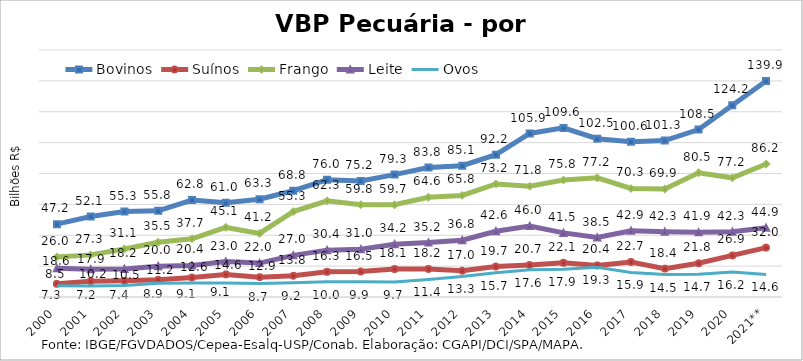
| Category | Bovinos | Suínos | Frango | Leite | Ovos |
|---|---|---|---|---|---|
| 2000 | 47.173 | 8.541 | 25.957 | 18.633 | 7.285 |
| 2001 | 52.145 | 10.247 | 27.283 | 17.93 | 7.179 |
| 2002 | 55.336 | 10.503 | 31.142 | 18.155 | 7.396 |
| 2003 | 55.848 | 11.225 | 35.505 | 19.993 | 8.947 |
| 2004 | 62.836 | 12.62 | 37.701 | 20.434 | 9.068 |
| 2005 | 61.005 | 14.632 | 45.074 | 22.982 | 9.129 |
| 2006 | 63.338 | 12.871 | 41.178 | 21.952 | 8.672 |
| 2007 | 68.833 | 13.763 | 55.326 | 26.987 | 9.216 |
| 2008 | 76 | 16.296 | 62.279 | 30.359 | 9.954 |
| 2009 | 75.208 | 16.473 | 59.797 | 30.951 | 9.925 |
| 2010 | 79.291 | 18.122 | 59.725 | 34.181 | 9.653 |
| 2011 | 83.823 | 18.151 | 64.595 | 35.237 | 11.374 |
| 2012 | 85.073 | 17.042 | 65.801 | 36.821 | 13.333 |
| 2013 | 92.189 | 19.733 | 73.237 | 42.609 | 15.682 |
| 2014 | 105.908 | 20.726 | 71.756 | 46.012 | 17.619 |
| 2015 | 109.553 | 22.149 | 75.752 | 41.534 | 17.94 |
| 2016 | 102.547 | 20.44 | 77.186 | 38.539 | 19.34 |
| 2017 | 100.632 | 22.691 | 70.303 | 42.94 | 15.941 |
| 2018 | 101.306 | 18.377 | 69.92 | 42.302 | 14.496 |
| 2019 | 108.477 | 21.843 | 80.505 | 41.91 | 14.681 |
| 2020 | 124.238 | 26.927 | 77.187 | 42.292 | 16.171 |
| 2021** | 139.901 | 31.986 | 86.16 | 44.91 | 14.605 |